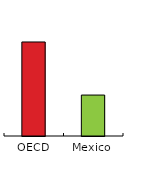
| Category | % low performers |
|---|---|
| OECD | 67.769 |
| Mexico | 29.505 |